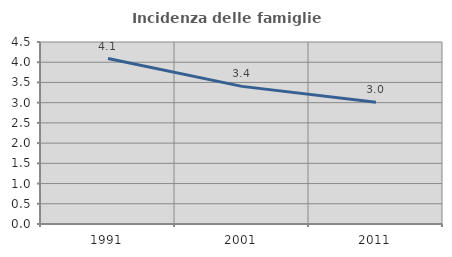
| Category | Incidenza delle famiglie numerose |
|---|---|
| 1991.0 | 4.091 |
| 2001.0 | 3.403 |
| 2011.0 | 3.01 |